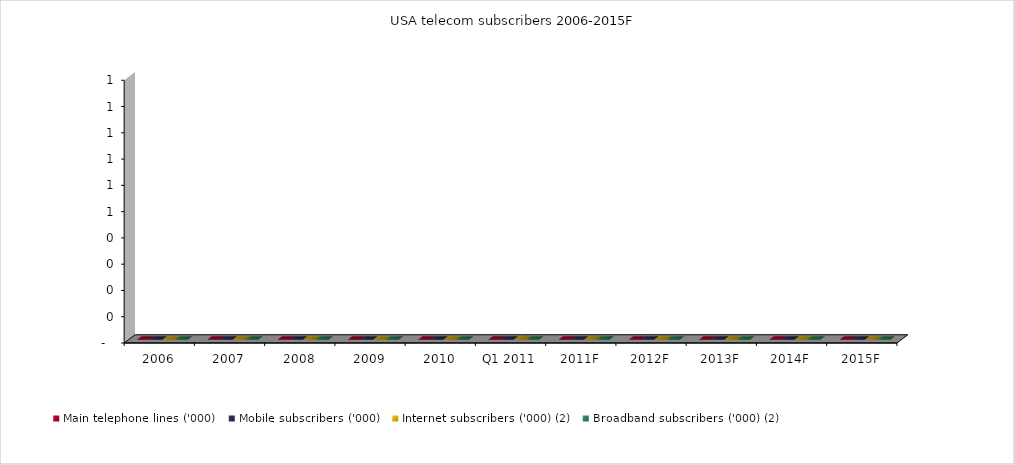
| Category | Main telephone lines ('000) | Mobile subscribers ('000) | Internet subscribers ('000) (2) | Broadband subscribers ('000) (2) |
|---|---|---|---|---|
| 2006 | 0 | 0 | 0 | 0 |
| 2007 | 0 | 0 | 0 | 0 |
| 2008 | 0 | 0 | 0 | 0 |
| 2009 | 0 | 0 | 0 | 0 |
| 2010 | 0 | 0 | 0 | 0 |
| Q1 2011 | 0 | 0 | 0 | 0 |
| 2011F | 0 | 0 | 0 | 0 |
| 2012F | 0 | 0 | 0 | 0 |
| 2013F | 0 | 0 | 0 | 0 |
| 2014F | 0 | 0 | 0 | 0 |
| 2015F | 0 | 0 | 0 | 0 |